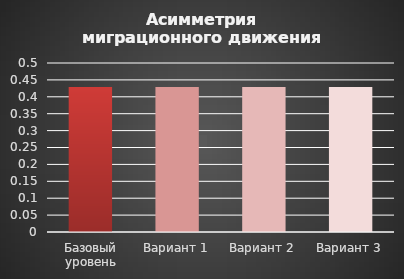
| Category | Асимметрия миграционного движения населения |
|---|---|
| Базовый уровень | 0.429 |
| Вариант 1 | 0.429 |
| Вариант 2 | 0.429 |
| Вариант 3 | 0.429 |